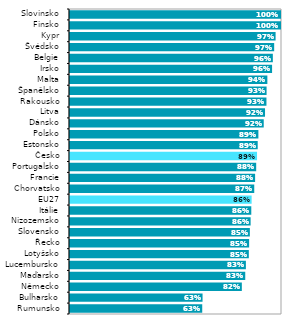
| Category | Series 0 |
|---|---|
| Rumunsko | 0.628 |
| Bulharsko | 0.63 |
| Německo | 0.815 |
| Maďarsko | 0.831 |
| Lucembursko | 0.834 |
| Lotyšsko | 0.848 |
| Řecko | 0.85 |
| Slovensko | 0.853 |
| Nizozemsko | 0.857 |
| Itálie | 0.86 |
| EU27 | 0.861 |
| Chorvatsko | 0.874 |
| Francie | 0.878 |
| Portugalsko | 0.883 |
| Česko | 0.887 |
| Estonsko | 0.89 |
| Polsko | 0.893 |
| Dánsko | 0.919 |
| Litva | 0.925 |
| Rakousko | 0.931 |
| Španělsko | 0.932 |
| Malta | 0.936 |
| Irsko | 0.958 |
| Belgie | 0.962 |
| Švédsko | 0.968 |
| Kypr | 0.974 |
| Finsko | 1 |
| Slovinsko | 1 |